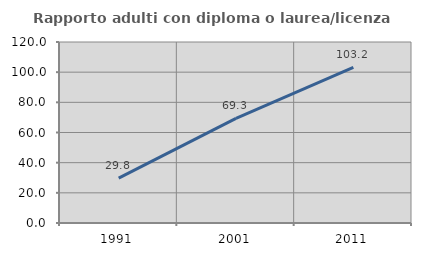
| Category | Rapporto adulti con diploma o laurea/licenza media  |
|---|---|
| 1991.0 | 29.787 |
| 2001.0 | 69.34 |
| 2011.0 | 103.187 |